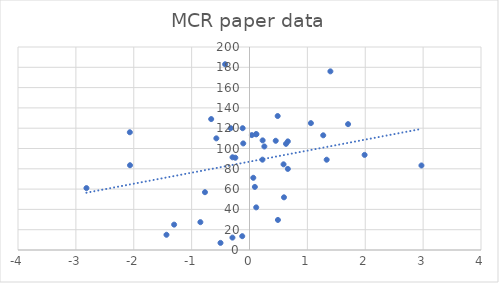
| Category | Series 0 |
|---|---|
| -0.324444 | 120 |
| 0.453295 | 107.6 |
| 0.040259 | 113.2 |
| 0.486838 | 132 |
| -1.302399 | 25 |
| 0.224012 | 89 |
| -2.064652 | 83.5 |
| -0.500908 | 7 |
| 1.988892 | 93.7 |
| 0.630602 | 104.6 |
| -0.421246 | 183 |
| 0.49116 | 29.6 |
| -0.294732 | 12.2 |
| 0.119883 | 114.1 |
| -2.817278 | 61 |
| 1.703197 | 124 |
| -0.108056 | 105 |
| 0.588321 | 84.4 |
| -1.434603 | 15 |
| 0.116059 | 42 |
| 0.595772 | 51.9 |
| 0.662588 | 107 |
| -0.572878 | 110 |
| 2.970948 | 83.28 |
| 1.060976 | 125 |
| -2.067601 | 116 |
| 0.110727 | 114 |
| -0.293477 | 91.33 |
| -0.661979 | 129 |
| -0.244798 | 90.91 |
| -0.84875 | 27.43 |
| 1.397693 | 176 |
| -0.769549 | 56.96 |
| 0.092632 | 62.14 |
| 0.256635 | 102 |
| -0.118373 | 120 |
| 0.226977 | 108 |
| 0.065349 | 71.13 |
| 0.66236 | 79.89 |
| 1.333541 | 88.95 |
| 1.273767 | 113 |
| -0.125599 | 13.62 |